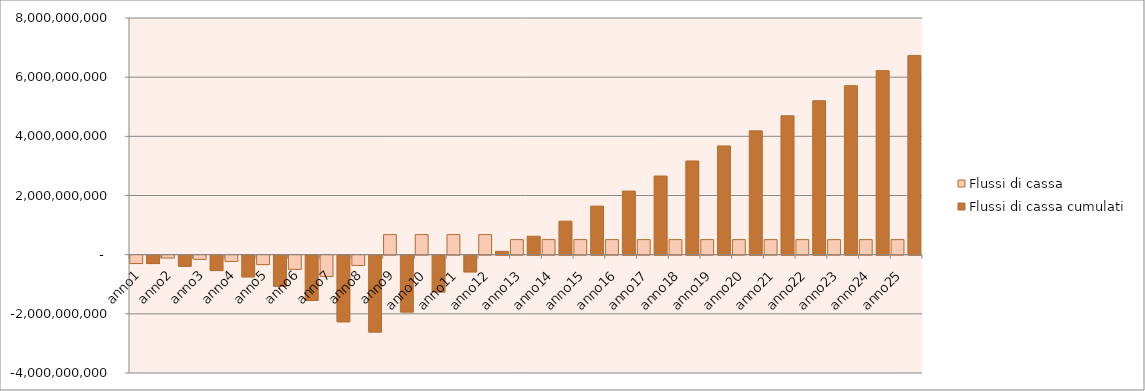
| Category | Flussi di cassa | Flussi di cassa cumulati |
|---|---|---|
| anno1 | -283200000 | -283200000 |
| anno2 | -94800000 | -378000000 |
| anno3 | -142200000 | -520200000 |
| anno4 | -213300000 | -733500000 |
| anno5 | -319950000 | -1053450000 |
| anno6 | -479925000 | -1533375000 |
| anno7 | -719887500 | -2253262500 |
| anno8 | -347493750 | -2600756250 |
| anno9 | 678600000 | -1922156250 |
| anno10 | 678600000 | -1243556250 |
| anno11 | 678600000 | -564956250 |
| anno12 | 678600000 | 113643750 |
| anno13 | 508950000 | 622593750 |
| anno14 | 508950000 | 1131543750 |
| anno15 | 508950000 | 1640493750 |
| anno16 | 508950000 | 2149443750 |
| anno17 | 508950000 | 2658393750 |
| anno18 | 508950000 | 3167343750 |
| anno19 | 508950000 | 3676293750 |
| anno20 | 508950000 | 4185243750 |
| anno21 | 508950000 | 4694193750 |
| anno22 | 508950000 | 5203143750 |
| anno23 | 508950000 | 5712093750 |
| anno24 | 508950000 | 6221043750 |
| anno25 | 508950000 | 6729993750 |